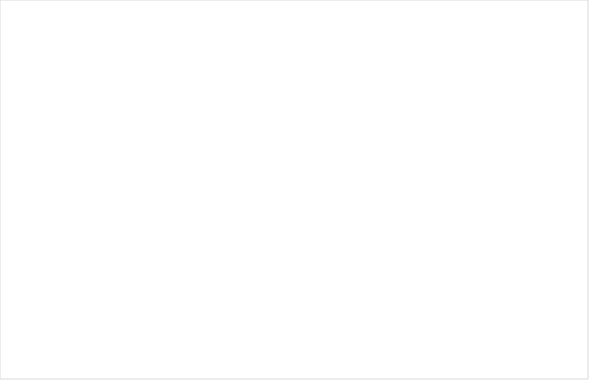
| Category | Financiële afwijzingen | Inhoudelijke afwijzingen | Overige afwijzingen |
|---|---|---|---|
| 2012 | 29748 | 23125 | 3856 |
| 2013 | 27076 | 17934 | 3099 |
| 2014 | 23991 | 14116 | 2320 |
| 2015 | 18203 | 11772 | 1907 |
| 2016 | 17369 | 11524 | 1917 |
| 2017 | 16164 | 10219 | 1291 |
| 2018 | 14773 | 10422 | 853 |
| 2019 | 14418 | 12173 | 1056 |
| 2020 | 14803 | 10793 | 1041 |
| 2021 | 13453 | 9070 | 383 |
| 2022 | 14504 | 9417 | 505 |